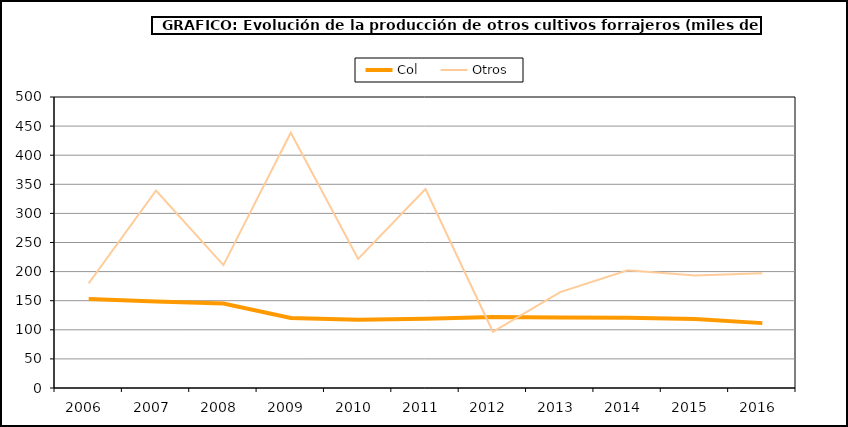
| Category | Col | Otros |
|---|---|---|
| 2006.0 | 152.735 | 179.843 |
| 2007.0 | 148.425 | 339.369 |
| 2008.0 | 145.208 | 211.156 |
| 2009.0 | 120.292 | 438.536 |
| 2010.0 | 117.345 | 221.872 |
| 2011.0 | 118.869 | 341.873 |
| 2012.0 | 122.008 | 96.567 |
| 2013.0 | 121.043 | 164.745 |
| 2014.0 | 120.638 | 202.445 |
| 2015.0 | 118.726 | 193.293 |
| 2016.0 | 111.472 | 197.303 |